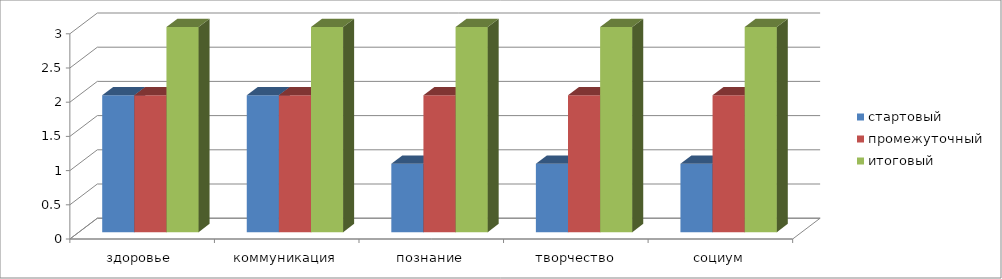
| Category | стартовый | промежуточный | итоговый |
|---|---|---|---|
| здоровье  | 2 | 2 | 3 |
| коммуникация | 2 | 2 | 3 |
| познание | 1 | 2 | 3 |
| творчество | 1 | 2 | 3 |
| социум | 1 | 2 | 3 |